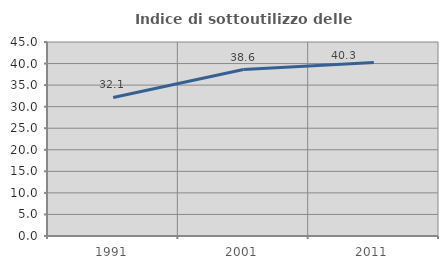
| Category | Indice di sottoutilizzo delle abitazioni  |
|---|---|
| 1991.0 | 32.143 |
| 2001.0 | 38.614 |
| 2011.0 | 40.271 |